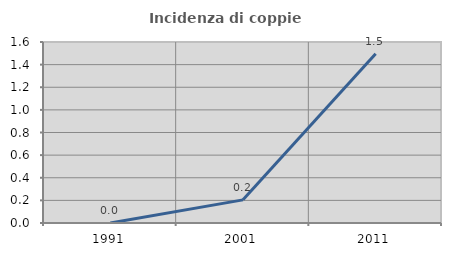
| Category | Incidenza di coppie miste |
|---|---|
| 1991.0 | 0 |
| 2001.0 | 0.204 |
| 2011.0 | 1.496 |